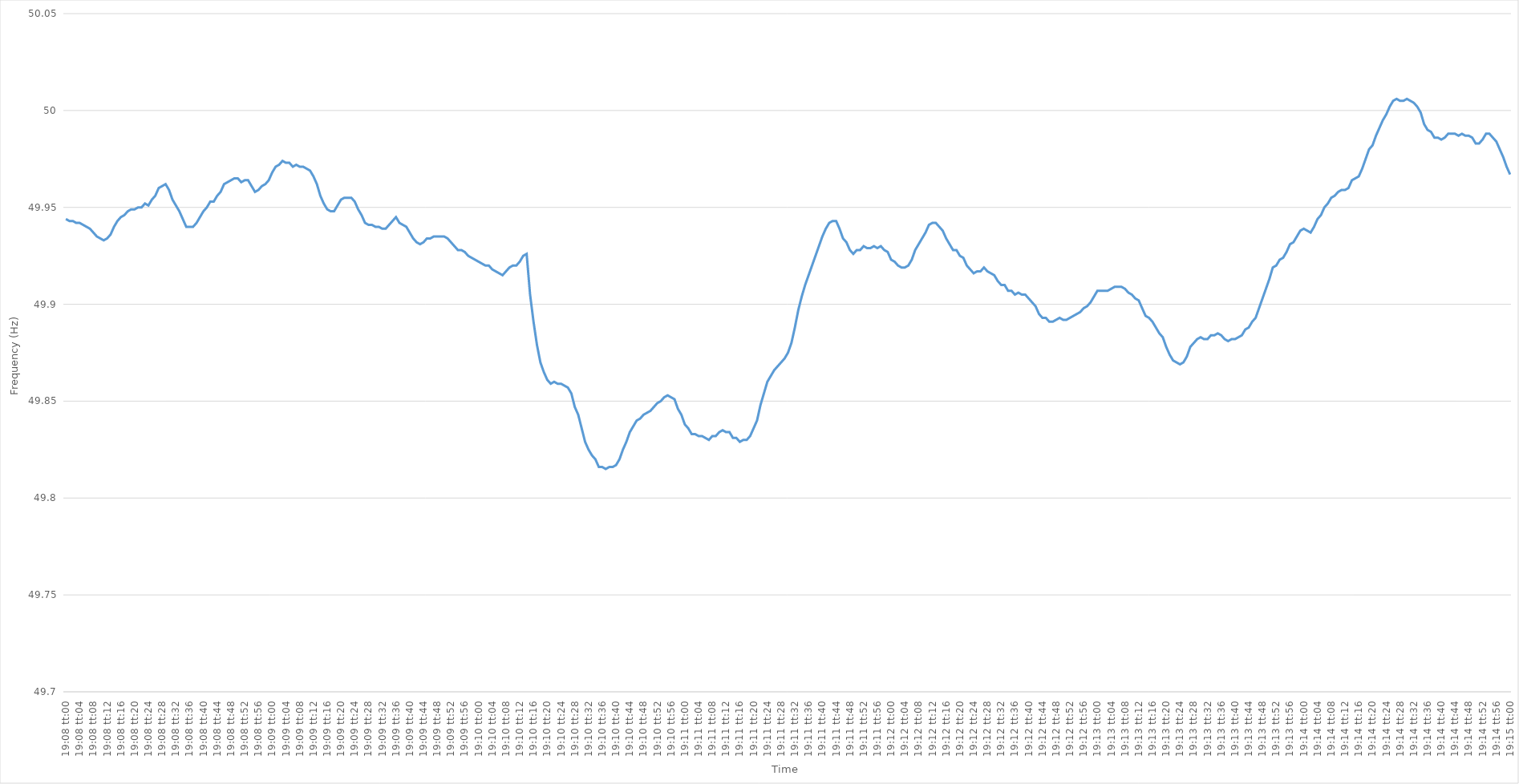
| Category | Series 0 |
|---|---|
| 0.7972222222222222 | 49.944 |
| 0.7972337962962963 | 49.943 |
| 0.7972453703703705 | 49.943 |
| 0.7972569444444444 | 49.942 |
| 0.7972685185185185 | 49.942 |
| 0.7972800925925926 | 49.941 |
| 0.7972916666666667 | 49.94 |
| 0.7973032407407407 | 49.939 |
| 0.7973148148148148 | 49.937 |
| 0.797326388888889 | 49.935 |
| 0.797337962962963 | 49.934 |
| 0.797349537037037 | 49.933 |
| 0.7973611111111111 | 49.934 |
| 0.7973726851851852 | 49.936 |
| 0.7973842592592592 | 49.94 |
| 0.7973958333333333 | 49.943 |
| 0.7974074074074075 | 49.945 |
| 0.7974189814814815 | 49.946 |
| 0.7974305555555555 | 49.948 |
| 0.7974421296296296 | 49.949 |
| 0.7974537037037037 | 49.949 |
| 0.7974652777777779 | 49.95 |
| 0.7974768518518518 | 49.95 |
| 0.797488425925926 | 49.952 |
| 0.7975 | 49.951 |
| 0.7975115740740741 | 49.954 |
| 0.7975231481481481 | 49.956 |
| 0.7975347222222222 | 49.96 |
| 0.7975462962962964 | 49.961 |
| 0.7975578703703704 | 49.962 |
| 0.7975694444444444 | 49.959 |
| 0.7975810185185185 | 49.954 |
| 0.7975925925925926 | 49.951 |
| 0.7976041666666666 | 49.948 |
| 0.7976157407407407 | 49.944 |
| 0.7976273148148149 | 49.94 |
| 0.7976388888888889 | 49.94 |
| 0.7976504629629629 | 49.94 |
| 0.797662037037037 | 49.942 |
| 0.7976736111111111 | 49.945 |
| 0.7976851851851853 | 49.948 |
| 0.7976967592592592 | 49.95 |
| 0.7977083333333334 | 49.953 |
| 0.7977199074074074 | 49.953 |
| 0.7977314814814815 | 49.956 |
| 0.7977430555555555 | 49.958 |
| 0.7977546296296296 | 49.962 |
| 0.7977662037037038 | 49.963 |
| 0.7977777777777778 | 49.964 |
| 0.7977893518518518 | 49.965 |
| 0.7978009259259259 | 49.965 |
| 0.7978125 | 49.963 |
| 0.797824074074074 | 49.964 |
| 0.7978356481481481 | 49.964 |
| 0.7978472222222223 | 49.961 |
| 0.7978587962962963 | 49.958 |
| 0.7978703703703703 | 49.959 |
| 0.7978819444444444 | 49.961 |
| 0.7978935185185185 | 49.962 |
| 0.7979050925925927 | 49.964 |
| 0.7979166666666666 | 49.968 |
| 0.7979282407407408 | 49.971 |
| 0.7979398148148148 | 49.972 |
| 0.797951388888889 | 49.974 |
| 0.7979629629629629 | 49.973 |
| 0.797974537037037 | 49.973 |
| 0.7979861111111112 | 49.971 |
| 0.7979976851851852 | 49.972 |
| 0.7980092592592593 | 49.971 |
| 0.7980208333333333 | 49.971 |
| 0.7980324074074074 | 49.97 |
| 0.7980439814814816 | 49.969 |
| 0.7980555555555555 | 49.966 |
| 0.7980671296296297 | 49.962 |
| 0.7980787037037037 | 49.956 |
| 0.7980902777777777 | 49.952 |
| 0.7981018518518518 | 49.949 |
| 0.7981134259259259 | 49.948 |
| 0.7981250000000001 | 49.948 |
| 0.798136574074074 | 49.951 |
| 0.7981481481481482 | 49.954 |
| 0.7981597222222222 | 49.955 |
| 0.7981712962962964 | 49.955 |
| 0.7981828703703703 | 49.955 |
| 0.7981944444444444 | 49.953 |
| 0.7982060185185186 | 49.949 |
| 0.7982175925925926 | 49.946 |
| 0.7982291666666667 | 49.942 |
| 0.7982407407407407 | 49.941 |
| 0.7982523148148148 | 49.941 |
| 0.798263888888889 | 49.94 |
| 0.7982754629629629 | 49.94 |
| 0.7982870370370371 | 49.939 |
| 0.7982986111111111 | 49.939 |
| 0.7983101851851852 | 49.941 |
| 0.7983217592592592 | 49.943 |
| 0.7983333333333333 | 49.945 |
| 0.7983449074074075 | 49.942 |
| 0.7983564814814814 | 49.941 |
| 0.7983680555555556 | 49.94 |
| 0.7983796296296296 | 49.937 |
| 0.7983912037037038 | 49.934 |
| 0.7984027777777777 | 49.932 |
| 0.7984143518518518 | 49.931 |
| 0.798425925925926 | 49.932 |
| 0.7984375 | 49.934 |
| 0.7984490740740741 | 49.934 |
| 0.7984606481481481 | 49.935 |
| 0.7984722222222222 | 49.935 |
| 0.7984837962962964 | 49.935 |
| 0.7984953703703703 | 49.935 |
| 0.7985069444444445 | 49.934 |
| 0.7985185185185185 | 49.932 |
| 0.7985300925925927 | 49.93 |
| 0.7985416666666666 | 49.928 |
| 0.7985532407407407 | 49.928 |
| 0.7985648148148149 | 49.927 |
| 0.7985763888888888 | 49.925 |
| 0.798587962962963 | 49.924 |
| 0.798599537037037 | 49.923 |
| 0.7986111111111112 | 49.922 |
| 0.7986226851851851 | 49.921 |
| 0.7986342592592592 | 49.92 |
| 0.7986458333333334 | 49.92 |
| 0.7986574074074074 | 49.918 |
| 0.7986689814814815 | 49.917 |
| 0.7986805555555555 | 49.916 |
| 0.7986921296296297 | 49.915 |
| 0.7987037037037038 | 49.917 |
| 0.7987152777777777 | 49.919 |
| 0.7987268518518519 | 49.92 |
| 0.7987384259259259 | 49.92 |
| 0.7987500000000001 | 49.922 |
| 0.798761574074074 | 49.925 |
| 0.7987731481481481 | 49.926 |
| 0.7987847222222223 | 49.905 |
| 0.7987962962962962 | 49.891 |
| 0.7988078703703704 | 49.879 |
| 0.7988194444444444 | 49.87 |
| 0.7988310185185186 | 49.865 |
| 0.7988425925925925 | 49.861 |
| 0.7988541666666666 | 49.859 |
| 0.7988657407407408 | 49.86 |
| 0.7988773148148148 | 49.859 |
| 0.7988888888888889 | 49.859 |
| 0.7989004629629629 | 49.858 |
| 0.7989120370370371 | 49.857 |
| 0.7989236111111112 | 49.854 |
| 0.7989351851851851 | 49.847 |
| 0.7989467592592593 | 49.843 |
| 0.7989583333333333 | 49.836 |
| 0.7989699074074075 | 49.829 |
| 0.7989814814814814 | 49.825 |
| 0.7989930555555556 | 49.822 |
| 0.7990046296296297 | 49.82 |
| 0.7990162037037036 | 49.816 |
| 0.7990277777777778 | 49.816 |
| 0.7990393518518518 | 49.815 |
| 0.799050925925926 | 49.816 |
| 0.7990624999999999 | 49.816 |
| 0.799074074074074 | 49.817 |
| 0.7990856481481482 | 49.82 |
| 0.7990972222222222 | 49.825 |
| 0.7991087962962963 | 49.829 |
| 0.7991203703703703 | 49.834 |
| 0.7991319444444445 | 49.837 |
| 0.7991435185185186 | 49.84 |
| 0.7991550925925925 | 49.841 |
| 0.7991666666666667 | 49.843 |
| 0.7991782407407407 | 49.844 |
| 0.7991898148148149 | 49.845 |
| 0.7992013888888888 | 49.847 |
| 0.799212962962963 | 49.849 |
| 0.7992245370370371 | 49.85 |
| 0.7992361111111111 | 49.852 |
| 0.7992476851851852 | 49.853 |
| 0.7992592592592592 | 49.852 |
| 0.7992708333333334 | 49.851 |
| 0.7992824074074073 | 49.846 |
| 0.7992939814814815 | 49.843 |
| 0.7993055555555556 | 49.838 |
| 0.7993171296296296 | 49.836 |
| 0.7993287037037037 | 49.833 |
| 0.7993402777777777 | 49.833 |
| 0.7993518518518519 | 49.832 |
| 0.799363425925926 | 49.832 |
| 0.799375 | 49.831 |
| 0.7993865740740741 | 49.83 |
| 0.7993981481481481 | 49.832 |
| 0.7994097222222223 | 49.832 |
| 0.7994212962962962 | 49.834 |
| 0.7994328703703704 | 49.835 |
| 0.7994444444444445 | 49.834 |
| 0.7994560185185186 | 49.834 |
| 0.7994675925925926 | 49.831 |
| 0.7994791666666666 | 49.831 |
| 0.7994907407407408 | 49.829 |
| 0.7995023148148147 | 49.83 |
| 0.7995138888888889 | 49.83 |
| 0.799525462962963 | 49.832 |
| 0.799537037037037 | 49.836 |
| 0.7995486111111111 | 49.84 |
| 0.7995601851851851 | 49.848 |
| 0.7995717592592593 | 49.854 |
| 0.7995833333333334 | 49.86 |
| 0.7995949074074074 | 49.863 |
| 0.7996064814814815 | 49.866 |
| 0.7996180555555555 | 49.868 |
| 0.7996296296296297 | 49.87 |
| 0.7996412037037036 | 49.872 |
| 0.7996527777777778 | 49.875 |
| 0.7996643518518519 | 49.88 |
| 0.799675925925926 | 49.888 |
| 0.7996875 | 49.897 |
| 0.799699074074074 | 49.904 |
| 0.7997106481481482 | 49.91 |
| 0.7997222222222221 | 49.915 |
| 0.7997337962962963 | 49.92 |
| 0.7997453703703704 | 49.925 |
| 0.7997569444444445 | 49.93 |
| 0.7997685185185185 | 49.935 |
| 0.7997800925925925 | 49.939 |
| 0.7997916666666667 | 49.942 |
| 0.7998032407407408 | 49.943 |
| 0.7998148148148148 | 49.943 |
| 0.7998263888888889 | 49.939 |
| 0.799837962962963 | 49.934 |
| 0.7998495370370371 | 49.932 |
| 0.799861111111111 | 49.928 |
| 0.7998726851851852 | 49.926 |
| 0.7998842592592593 | 49.928 |
| 0.7998958333333334 | 49.928 |
| 0.7999074074074074 | 49.93 |
| 0.7999189814814814 | 49.929 |
| 0.7999305555555556 | 49.929 |
| 0.7999421296296297 | 49.93 |
| 0.7999537037037037 | 49.929 |
| 0.7999652777777778 | 49.93 |
| 0.7999768518518519 | 49.928 |
| 0.7999884259259259 | 49.927 |
| 0.7999999999999999 | 49.923 |
| 0.8000115740740741 | 49.922 |
| 0.8000231481481482 | 49.92 |
| 0.8000347222222222 | 49.919 |
| 0.8000462962962963 | 49.919 |
| 0.8000578703703703 | 49.92 |
| 0.8000694444444445 | 49.923 |
| 0.8000810185185184 | 49.928 |
| 0.8000925925925926 | 49.931 |
| 0.8001041666666667 | 49.934 |
| 0.8001157407407408 | 49.937 |
| 0.8001273148148148 | 49.941 |
| 0.8001388888888888 | 49.942 |
| 0.800150462962963 | 49.942 |
| 0.8001620370370371 | 49.94 |
| 0.8001736111111111 | 49.938 |
| 0.8001851851851852 | 49.934 |
| 0.8001967592592593 | 49.931 |
| 0.8002083333333333 | 49.928 |
| 0.8002199074074073 | 49.928 |
| 0.8002314814814815 | 49.925 |
| 0.8002430555555556 | 49.924 |
| 0.8002546296296296 | 49.92 |
| 0.8002662037037037 | 49.918 |
| 0.8002777777777778 | 49.916 |
| 0.8002893518518519 | 49.917 |
| 0.8003009259259258 | 49.917 |
| 0.8003125 | 49.919 |
| 0.8003240740740741 | 49.917 |
| 0.8003356481481482 | 49.916 |
| 0.8003472222222222 | 49.915 |
| 0.8003587962962962 | 49.912 |
| 0.8003703703703704 | 49.91 |
| 0.8003819444444445 | 49.91 |
| 0.8003935185185185 | 49.907 |
| 0.8004050925925926 | 49.907 |
| 0.8004166666666667 | 49.905 |
| 0.8004282407407407 | 49.906 |
| 0.8004398148148147 | 49.905 |
| 0.8004513888888889 | 49.905 |
| 0.800462962962963 | 49.903 |
| 0.800474537037037 | 49.901 |
| 0.8004861111111111 | 49.899 |
| 0.8004976851851852 | 49.895 |
| 0.8005092592592593 | 49.893 |
| 0.8005208333333332 | 49.893 |
| 0.8005324074074074 | 49.891 |
| 0.8005439814814815 | 49.891 |
| 0.8005555555555556 | 49.892 |
| 0.8005671296296296 | 49.893 |
| 0.8005787037037037 | 49.892 |
| 0.8005902777777778 | 49.892 |
| 0.800601851851852 | 49.893 |
| 0.8006134259259259 | 49.894 |
| 0.800625 | 49.895 |
| 0.8006365740740741 | 49.896 |
| 0.8006481481481482 | 49.898 |
| 0.8006597222222221 | 49.899 |
| 0.8006712962962963 | 49.901 |
| 0.8006828703703704 | 49.904 |
| 0.8006944444444444 | 49.907 |
| 0.8007060185185185 | 49.907 |
| 0.8007175925925926 | 49.907 |
| 0.8007291666666667 | 49.907 |
| 0.8007407407407406 | 49.908 |
| 0.8007523148148148 | 49.909 |
| 0.8007638888888889 | 49.909 |
| 0.800775462962963 | 49.909 |
| 0.800787037037037 | 49.908 |
| 0.8007986111111111 | 49.906 |
| 0.8008101851851852 | 49.905 |
| 0.8008217592592594 | 49.903 |
| 0.8008333333333333 | 49.902 |
| 0.8008449074074074 | 49.898 |
| 0.8008564814814815 | 49.894 |
| 0.8008680555555556 | 49.893 |
| 0.8008796296296296 | 49.891 |
| 0.8008912037037037 | 49.888 |
| 0.8009027777777779 | 49.885 |
| 0.8009143518518518 | 49.883 |
| 0.8009259259259259 | 49.878 |
| 0.8009375 | 49.874 |
| 0.8009490740740741 | 49.871 |
| 0.800960648148148 | 49.87 |
| 0.8009722222222222 | 49.869 |
| 0.8009837962962963 | 49.87 |
| 0.8009953703703704 | 49.873 |
| 0.8010069444444444 | 49.878 |
| 0.8010185185185185 | 49.88 |
| 0.8010300925925926 | 49.882 |
| 0.8010416666666668 | 49.883 |
| 0.8010532407407407 | 49.882 |
| 0.8010648148148148 | 49.882 |
| 0.8010763888888889 | 49.884 |
| 0.801087962962963 | 49.884 |
| 0.801099537037037 | 49.885 |
| 0.8011111111111111 | 49.884 |
| 0.8011226851851853 | 49.882 |
| 0.8011342592592593 | 49.881 |
| 0.8011458333333333 | 49.882 |
| 0.8011574074074074 | 49.882 |
| 0.8011689814814815 | 49.883 |
| 0.8011805555555555 | 49.884 |
| 0.8011921296296296 | 49.887 |
| 0.8012037037037038 | 49.888 |
| 0.8012152777777778 | 49.891 |
| 0.8012268518518518 | 49.893 |
| 0.8012384259259259 | 49.898 |
| 0.80125 | 49.903 |
| 0.8012615740740742 | 49.908 |
| 0.8012731481481481 | 49.913 |
| 0.8012847222222222 | 49.919 |
| 0.8012962962962963 | 49.92 |
| 0.8013078703703704 | 49.923 |
| 0.8013194444444444 | 49.924 |
| 0.8013310185185185 | 49.927 |
| 0.8013425925925927 | 49.931 |
| 0.8013541666666667 | 49.932 |
| 0.8013657407407407 | 49.935 |
| 0.8013773148148148 | 49.938 |
| 0.8013888888888889 | 49.939 |
| 0.8014004629629629 | 49.938 |
| 0.801412037037037 | 49.937 |
| 0.8014236111111112 | 49.94 |
| 0.8014351851851852 | 49.944 |
| 0.8014467592592592 | 49.946 |
| 0.8014583333333333 | 49.95 |
| 0.8014699074074074 | 49.952 |
| 0.8014814814814816 | 49.955 |
| 0.8014930555555555 | 49.956 |
| 0.8015046296296297 | 49.958 |
| 0.8015162037037037 | 49.959 |
| 0.8015277777777778 | 49.959 |
| 0.8015393518518518 | 49.96 |
| 0.8015509259259259 | 49.964 |
| 0.8015625000000001 | 49.965 |
| 0.8015740740740741 | 49.966 |
| 0.8015856481481481 | 49.97 |
| 0.8015972222222222 | 49.975 |
| 0.8016087962962963 | 49.98 |
| 0.8016203703703703 | 49.982 |
| 0.8016319444444444 | 49.987 |
| 0.8016435185185186 | 49.991 |
| 0.8016550925925926 | 49.995 |
| 0.8016666666666666 | 49.998 |
| 0.8016782407407407 | 50.002 |
| 0.8016898148148148 | 50.005 |
| 0.801701388888889 | 50.006 |
| 0.8017129629629629 | 50.005 |
| 0.801724537037037 | 50.005 |
| 0.8017361111111111 | 50.006 |
| 0.8017476851851852 | 50.005 |
| 0.8017592592592592 | 50.004 |
| 0.8017708333333333 | 50.002 |
| 0.8017824074074075 | 49.999 |
| 0.8017939814814815 | 49.993 |
| 0.8018055555555555 | 49.99 |
| 0.8018171296296296 | 49.989 |
| 0.8018287037037037 | 49.986 |
| 0.8018402777777779 | 49.986 |
| 0.8018518518518518 | 49.985 |
| 0.801863425925926 | 49.986 |
| 0.801875 | 49.988 |
| 0.801886574074074 | 49.988 |
| 0.8018981481481481 | 49.988 |
| 0.8019097222222222 | 49.987 |
| 0.8019212962962964 | 49.988 |
| 0.8019328703703703 | 49.987 |
| 0.8019444444444445 | 49.987 |
| 0.8019560185185185 | 49.986 |
| 0.8019675925925926 | 49.983 |
| 0.8019791666666666 | 49.983 |
| 0.8019907407407407 | 49.985 |
| 0.8020023148148149 | 49.988 |
| 0.8020138888888889 | 49.988 |
| 0.802025462962963 | 49.986 |
| 0.802037037037037 | 49.984 |
| 0.8020486111111111 | 49.98 |
| 0.8020601851851853 | 49.976 |
| 0.8020717592592592 | 49.971 |
| 0.8020833333333334 | 49.967 |